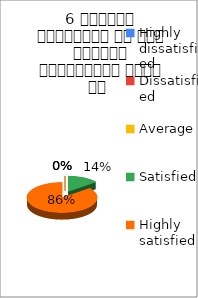
| Category | 6 शिक्षक समयनिष्ट है एवं नियमित व्याख्यान देते है  |
|---|---|
| Highly dissatisfied | 0 |
| Dissatisfied | 0 |
| Average | 0 |
| Satisfied | 1 |
| Highly satisfied | 6 |